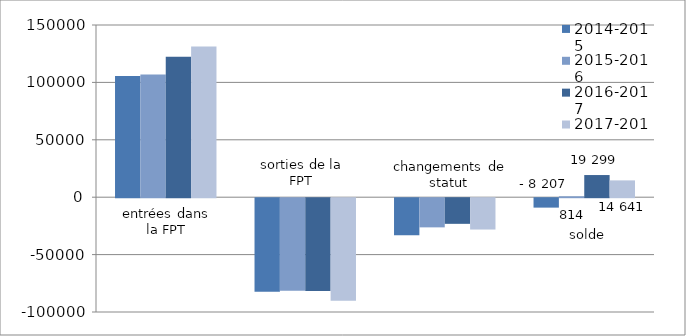
| Category | 2014-2015 | 2015-2016 | 2016-2017 | 2017-2018 |
|---|---|---|---|---|
| entrées dans la FPT | 105471 | 106875 | 122431 | 131340 |
| Sorties de la FPT | -81476 | -80653 | -80800 | -89408 |
| changement de statut | -32202 | -25408 | -22332 | -27291 |
| solde | -8207 | 814 | 19299 | 14641 |